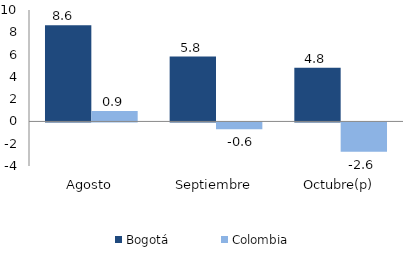
| Category | Bogotá | Colombia |
|---|---|---|
| Agosto | 8.63 | 0.933 |
| Septiembre | 5.819 | -0.602 |
| Octubre(p) | 4.82 | -2.626 |